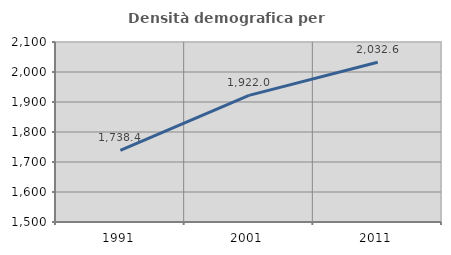
| Category | Densità demografica |
|---|---|
| 1991.0 | 1738.401 |
| 2001.0 | 1922.031 |
| 2011.0 | 2032.559 |